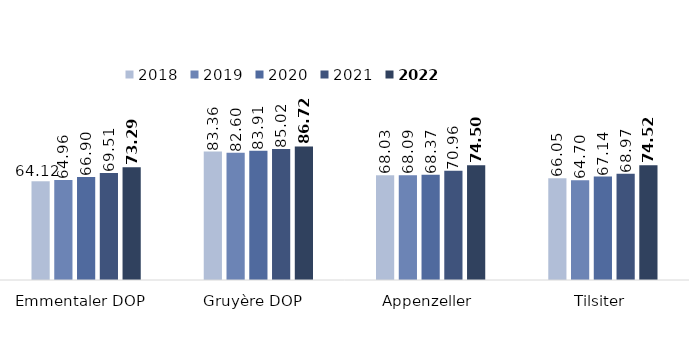
| Category | 2018 | 2019 | 2020 | 2021 | 2022 |
|---|---|---|---|---|---|
| Emmentaler DOP  | 64.121 | 64.958 | 66.901 | 69.506 | 73.287 |
| Gruyère DOP  | 83.362 | 82.598 | 83.914 | 85.021 | 86.723 |
| Appenzeller | 68.034 | 68.087 | 68.368 | 70.959 | 74.503 |
| Tilsiter | 66.053 | 64.698 | 67.143 | 68.975 | 74.517 |